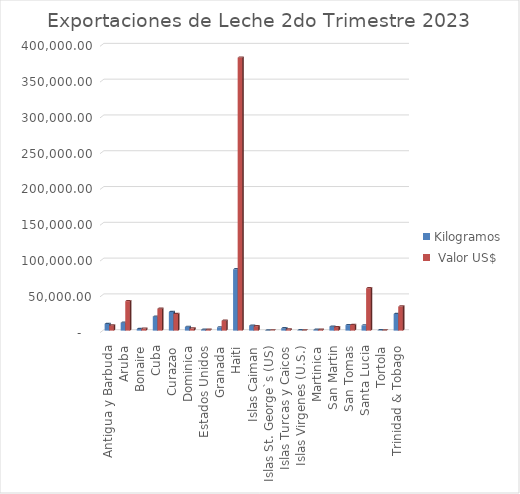
| Category | Kilogramos |  Valor US$ |
|---|---|---|
| Antigua y Barbuda | 9335.94 | 7279.92 |
| Aruba | 10946.33 | 41190.89 |
| Bonaire | 2237.17 | 2764 |
| Cuba | 19450.58 | 30557.78 |
| Curazao | 26075.75 | 23206.52 |
| Dominica | 5209.35 | 3107.7 |
| Estados Unidos | 1138.65 | 1163.24 |
| Granada | 4568.88 | 13797.42 |
| Haiti | 85614.51 | 381389.34 |
| Islas Caiman | 6884.63 | 6067 |
| Islas St. George`s (US) | 271.35 | 391.5 |
| Islas Turcas y Caicos | 3320.37 | 1715.4 |
| Islas Virgenes (U.S.) | 395.81 | 194.4 |
| Martinica | 1113.64 | 1151.24 |
| San Martin | 5534.52 | 4810.96 |
| San Tomas | 7705.09 | 7823.9 |
| Santa Lucia | 7292.16 | 59191.06 |
| Tortola | 445.15 | 174.1 |
| Trinidad & Tobago | 23239.53 | 33595.26 |